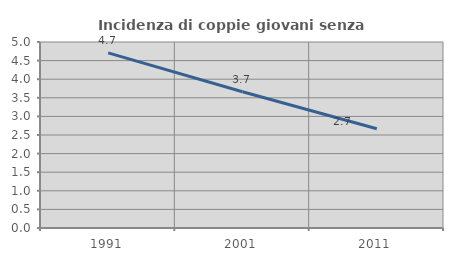
| Category | Incidenza di coppie giovani senza figli |
|---|---|
| 1991.0 | 4.709 |
| 2001.0 | 3.664 |
| 2011.0 | 2.666 |